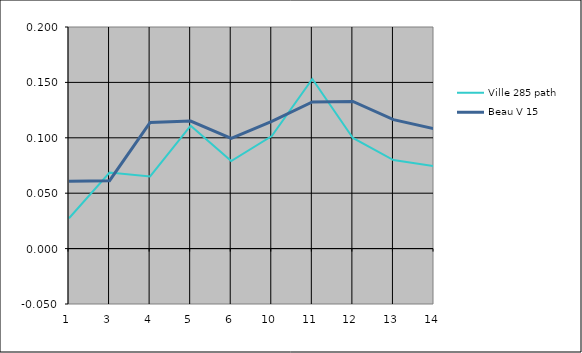
| Category | Ville 285 path | Beau V 15 |
|---|---|---|
| 1.0 | 0.027 | 0.061 |
| 3.0 | 0.069 | 0.061 |
| 4.0 | 0.065 | 0.114 |
| 5.0 | 0.111 | 0.115 |
| 6.0 | 0.079 | 0.099 |
| 10.0 | 0.102 | 0.115 |
| 11.0 | 0.153 | 0.132 |
| 12.0 | 0.1 | 0.133 |
| 13.0 | 0.08 | 0.116 |
| 14.0 | 0.074 | 0.108 |